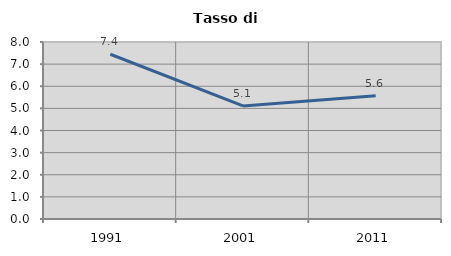
| Category | Tasso di disoccupazione   |
|---|---|
| 1991.0 | 7.447 |
| 2001.0 | 5.112 |
| 2011.0 | 5.569 |